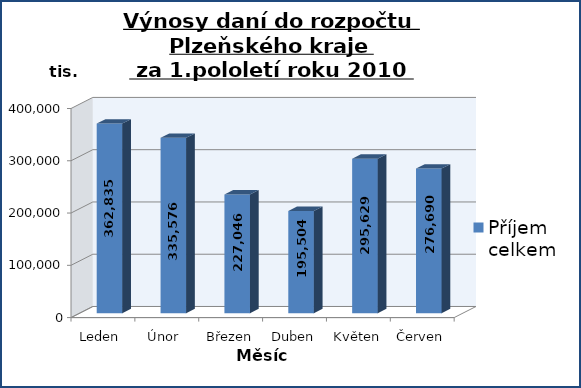
| Category | Příjem celkem |
|---|---|
| Leden  | 362834.53 |
| Únor  | 335575.527 |
| Březen | 227046.433 |
| Duben | 195504.29 |
| Květen | 295629.207 |
| Červen | 276690.331 |